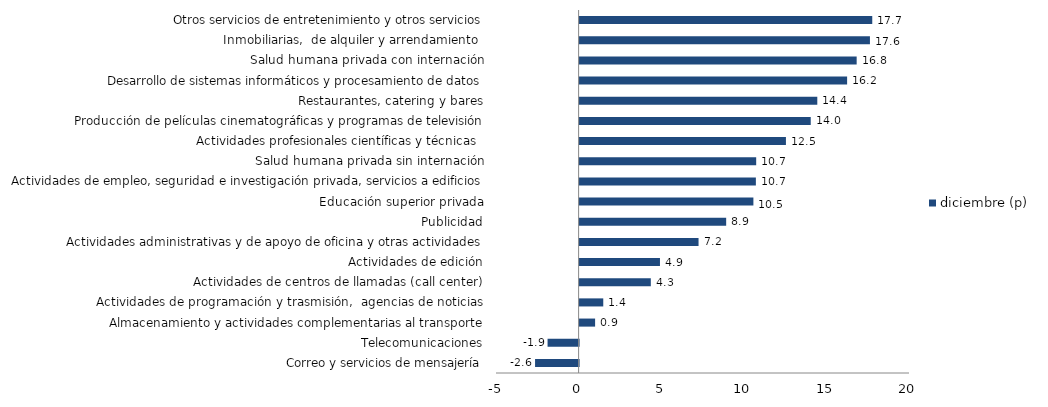
| Category | diciembre (p) |
|---|---|
| Correo y servicios de mensajería | -2.635 |
| Telecomunicaciones | -1.879 |
| Almacenamiento y actividades complementarias al transporte | 0.939 |
| Actividades de programación y trasmisión,  agencias de noticias | 1.433 |
| Actividades de centros de llamadas (call center) | 4.311 |
| Actividades de edición | 4.865 |
| Actividades administrativas y de apoyo de oficina y otras actividades | 7.2 |
| Publicidad | 8.872 |
| Educación superior privada | 10.52 |
| Actividades de empleo, seguridad e investigación privada, servicios a edificios | 10.67 |
| Salud humana privada sin internación | 10.689 |
| Actividades profesionales científicas y técnicas  | 12.49 |
| Producción de películas cinematográficas y programas de televisión | 13.992 |
| Restaurantes, catering y bares | 14.388 |
| Desarrollo de sistemas informáticos y procesamiento de datos | 16.193 |
| Salud humana privada con internación | 16.771 |
| Inmobiliarias,  de alquiler y arrendamiento  | 17.575 |
| Otros servicios de entretenimiento y otros servicios | 17.715 |